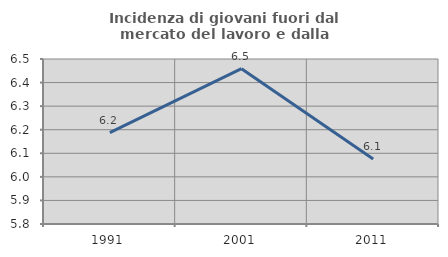
| Category | Incidenza di giovani fuori dal mercato del lavoro e dalla formazione  |
|---|---|
| 1991.0 | 6.187 |
| 2001.0 | 6.459 |
| 2011.0 | 6.075 |